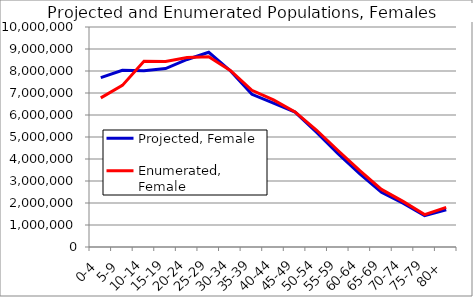
| Category | Projected, Female | Enumerated, Female |
|---|---|---|
| 0-4 | 7696322.461 | 6779172 |
| 5-9 | 8029745.622 | 7345231 |
| 10-14 | 8006239.233 | 8441348 |
| 15-19 | 8111077.075 | 8432002 |
| 20-24 | 8524849.489 | 8614963 |
| 25-29 | 8852898.858 | 8643418 |
| 30-34 | 8012890.213 | 8026855 |
| 35-39 | 6941449.689 | 7121916 |
| 40-44 | 6538418.252 | 6688797 |
| 45-49 | 6130653.575 | 6141338 |
| 50-54 | 5208108.706 | 5305407 |
| 55-59 | 4233113.197 | 4373875 |
| 60-64 | 3323513.936 | 3468085 |
| 65-69 | 2489215.332 | 2616745 |
| 70-74 | 1990427.713 | 2074264 |
| 75-79 | 1428460.079 | 1472930 |
| 80+ | 1693633.2 | 1802463 |